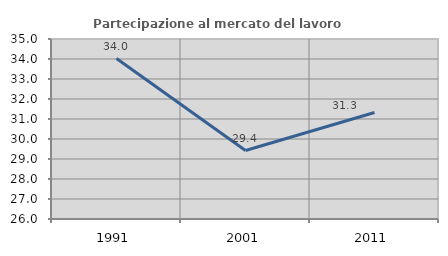
| Category | Partecipazione al mercato del lavoro  femminile |
|---|---|
| 1991.0 | 34.021 |
| 2001.0 | 29.423 |
| 2011.0 | 31.326 |